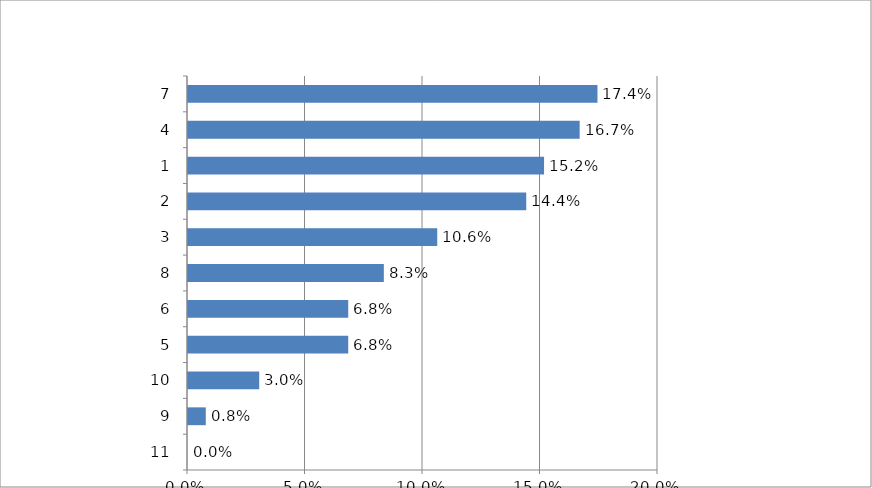
| Category | GT |
|---|---|
| 11.0 | 0 |
| 9.0 | 0.008 |
| 10.0 | 0.03 |
| 5.0 | 0.068 |
| 6.0 | 0.068 |
| 8.0 | 0.083 |
| 3.0 | 0.106 |
| 2.0 | 0.144 |
| 1.0 | 0.152 |
| 4.0 | 0.167 |
| 7.0 | 0.174 |